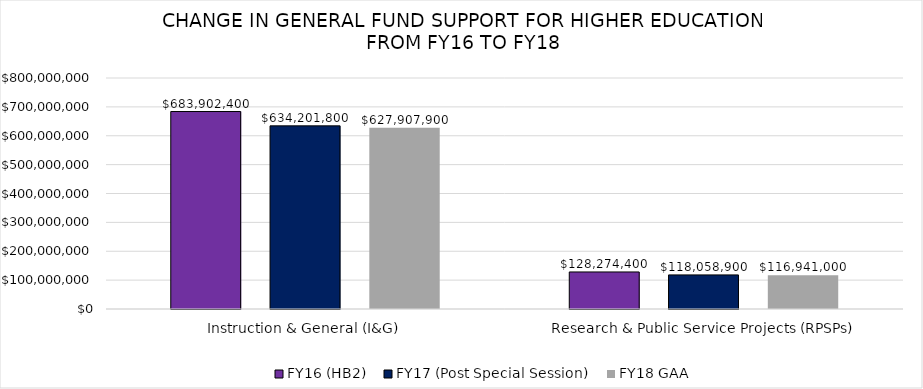
| Category | FY16 (HB2) | FY17 (Post Special Session) | FY18 GAA |
|---|---|---|---|
| Instruction & General (I&G) | 683902400 | 634201800 | 627907900 |
| Research & Public Service Projects (RPSPs) | 128274400 | 118058900 | 116941000 |